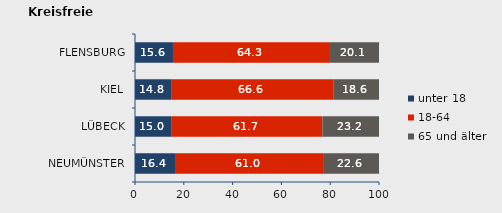
| Category | unter 18 | 18-64 | 65 und älter |
|---|---|---|---|
| NEUMÜNSTER | 16.4 | 61.015 | 22.585 |
| LÜBECK | 15.049 | 61.747 | 23.204 |
| KIEL | 14.795 | 66.635 | 18.57 |
| FLENSBURG | 15.561 | 64.341 | 20.097 |